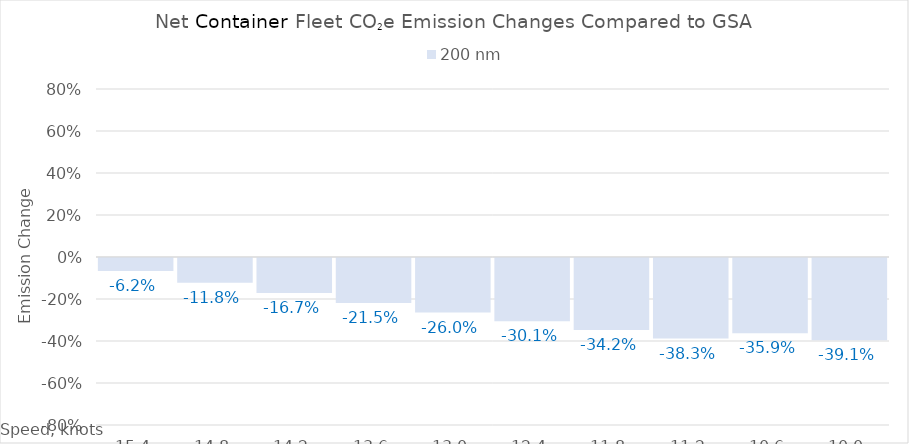
| Category | 200 |
|---|---|
| 15.4 | -0.062 |
| 14.8 | -0.118 |
| 14.200000000000001 | -0.167 |
| 13.600000000000001 | -0.215 |
| 13.000000000000002 | -0.26 |
| 12.400000000000002 | -0.301 |
| 11.800000000000002 | -0.342 |
| 11.200000000000003 | -0.383 |
| 10.600000000000003 | -0.359 |
| 10.000000000000004 | -0.391 |